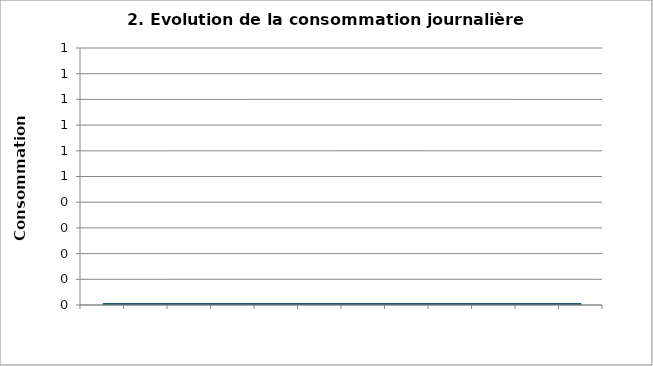
| Category | Consommation totale |
|---|---|
| 0 | 0 |
| 1900-01-01 | 0 |
| 1900-01-02 | 0 |
| 1900-01-03 | 0 |
| 1900-01-04 | 0 |
| 1900-01-05 | 0 |
| 1900-01-06 | 0 |
| 1900-01-07 | 0 |
| 1900-01-08 | 0 |
| 1900-01-09 | 0 |
| 1900-01-10 | 0 |
| 1900-01-11 | 0 |